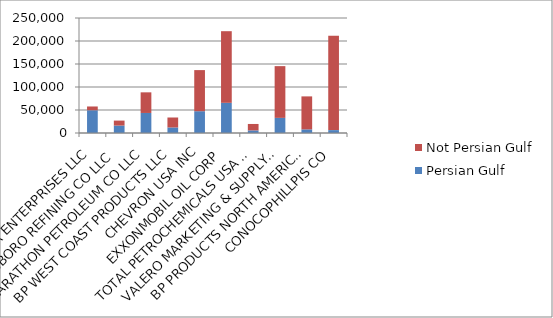
| Category | Persian Gulf | Not Persian Gulf |
|---|---|---|
| MOTIVA ENTERPRISES LLC | 49433 | 8216 |
| PAULSBORO REFINING CO LLC | 16144 | 10816 |
| MARATHON PETROLEUM CO LLC | 43563 | 44838 |
| BP WEST COAST PRODUCTS LLC | 12038 | 21649 |
| CHEVRON USA INC | 47382 | 89356 |
| EXXONMOBIL OIL CORP | 65602 | 155717 |
| TOTAL PETROCHEMICALS USA INC | 5663 | 13978 |
| VALERO MARKETING & SUPPLY CO | 32895 | 112470 |
| BP PRODUCTS NORTH AMERICA INC | 7901 | 71688 |
| CONOCOPHILLPIS CO | 6271 | 205025 |